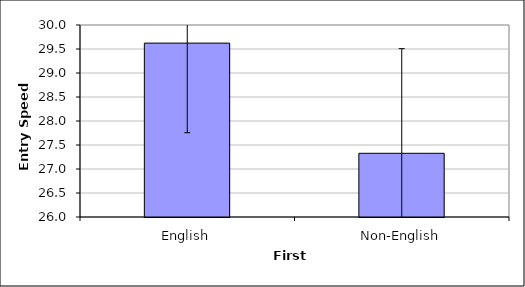
| Category | Series 0 |
|---|---|
| English | 29.623 |
| Non-English | 27.327 |